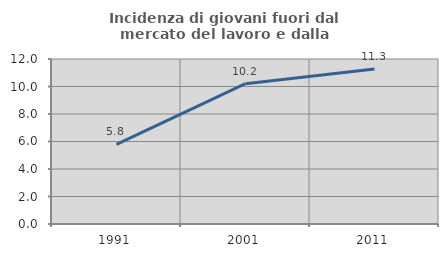
| Category | Incidenza di giovani fuori dal mercato del lavoro e dalla formazione  |
|---|---|
| 1991.0 | 5.797 |
| 2001.0 | 10.204 |
| 2011.0 | 11.268 |